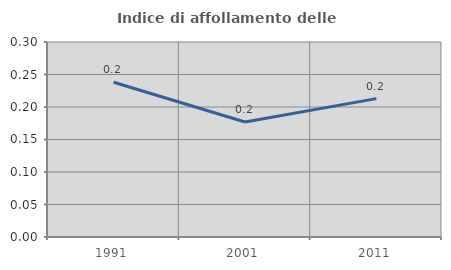
| Category | Indice di affollamento delle abitazioni  |
|---|---|
| 1991.0 | 0.238 |
| 2001.0 | 0.177 |
| 2011.0 | 0.213 |